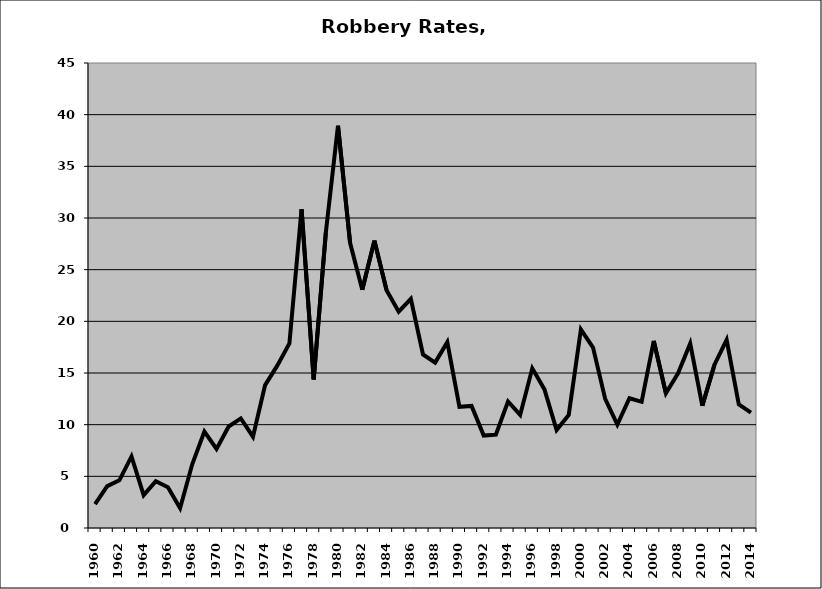
| Category | Robbery |
|---|---|
| 1960.0 | 2.308 |
| 1961.0 | 4.051 |
| 1962.0 | 4.615 |
| 1963.0 | 6.923 |
| 1964.0 | 3.178 |
| 1965.0 | 4.534 |
| 1966.0 | 3.951 |
| 1967.0 | 1.918 |
| 1968.0 | 6.161 |
| 1969.0 | 9.339 |
| 1970.0 | 7.645 |
| 1971.0 | 9.825 |
| 1972.0 | 10.606 |
| 1973.0 | 8.836 |
| 1974.0 | 13.83 |
| 1975.0 | 15.711 |
| 1976.0 | 17.857 |
| 1977.0 | 30.849 |
| 1978.0 | 14.374 |
| 1979.0 | 28.6 |
| 1980.0 | 38.92 |
| 1981.0 | 27.573 |
| 1982.0 | 23.062 |
| 1983.0 | 27.81 |
| 1984.0 | 23.019 |
| 1985.0 | 20.935 |
| 1986.0 | 22.181 |
| 1987.0 | 16.788 |
| 1988.0 | 16.007 |
| 1989.0 | 17.989 |
| 1990.0 | 11.728 |
| 1991.0 | 11.817 |
| 1992.0 | 8.947 |
| 1993.0 | 9.028 |
| 1994.0 | 12.241 |
| 1995.0 | 10.94 |
| 1996.0 | 15.45 |
| 1997.0 | 13.413 |
| 1998.0 | 9.475 |
| 1999.0 | 10.948 |
| 2000.0 | 19.217 |
| 2001.0 | 17.456 |
| 2002.0 | 12.492 |
| 2003.0 | 10.011 |
| 2004.0 | 12.556 |
| 2005.0 | 12.211 |
| 2006.0 | 18.112 |
| 2007.0 | 13.038 |
| 2008.0 | 14.975 |
| 2009.0 | 17.853 |
| 2010.0 | 11.826 |
| 2011.0 | 15.8 |
| 2012.0 | 18.212 |
| 2013.0 | 11.964 |
| 2014.0 | 11.172 |